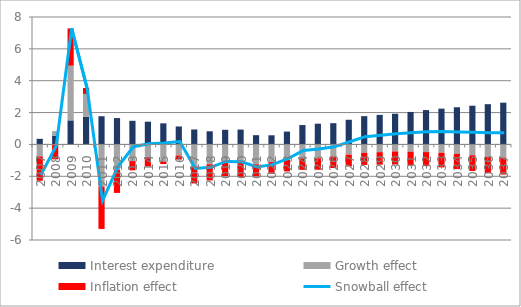
| Category | Interest expenditure | Growth effect | Inflation effect |
|---|---|---|---|
| 0 | 0.353 | -0.754 | -1.527 |
| 1 | 0.551 | 0.285 | -0.933 |
| 2 | 1.511 | 3.434 | 2.337 |
| 3 | 1.731 | 1.442 | 0.368 |
| 4 | 1.77 | -2.65 | -2.655 |
| 5 | 1.655 | -1.594 | -1.45 |
| 6 | 1.483 | -1.047 | -0.579 |
| 7 | 1.428 | -0.798 | -0.585 |
| 8 | 1.324 | -1.075 | -0.157 |
| 9 | 1.127 | -0.694 | -0.255 |
| 10 | 0.938 | -1.39 | -1.06 |
| 11 | 0.825 | -1.245 | -1.018 |
| 12 | 0.918 | -1.135 | -0.853 |
| 13 | 0.933 | -1.17 | -0.858 |
| 14 | 0.581 | -1.245 | -0.748 |
| 15 | 0.574 | -1.111 | -0.731 |
| 16 | 0.806 | -0.975 | -0.719 |
| 17 | 1.217 | -0.881 | -0.714 |
| 18 | 1.302 | -0.872 | -0.719 |
| 19 | 1.334 | -0.756 | -0.728 |
| 20 | 1.548 | -0.641 | -0.741 |
| 21 | 1.775 | -0.525 | -0.762 |
| 22 | 1.854 | -0.485 | -0.788 |
| 23 | 1.927 | -0.441 | -0.817 |
| 24 | 2.039 | -0.458 | -0.848 |
| 25 | 2.156 | -0.48 | -0.88 |
| 26 | 2.246 | -0.526 | -0.915 |
| 27 | 2.334 | -0.599 | -0.95 |
| 28 | 2.43 | -0.68 | -0.986 |
| 29 | 2.527 | -0.776 | -1.022 |
| 30 | 2.619 | -0.831 | -1.058 |